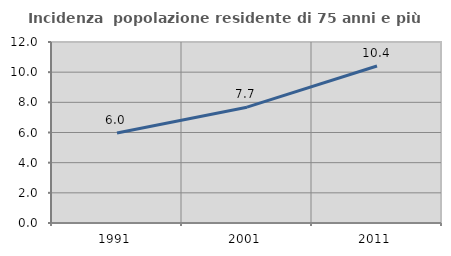
| Category | Incidenza  popolazione residente di 75 anni e più |
|---|---|
| 1991.0 | 5.972 |
| 2001.0 | 7.679 |
| 2011.0 | 10.408 |